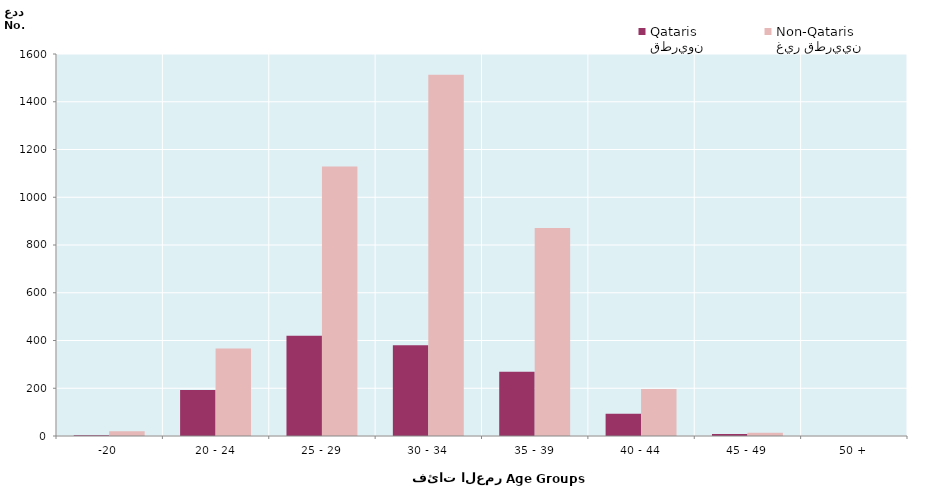
| Category | قطريون
Qataris | غير قطريين
Non-Qataris |
|---|---|---|
| -20 | 3 | 20 |
| 20 - 24 | 193 | 367 |
| 25 - 29 | 420 | 1129 |
| 30 - 34 | 380 | 1513 |
| 35 - 39 | 269 | 871 |
| 40 - 44 | 93 | 197 |
| 45 - 49 | 8 | 14 |
| 50 + | 0 | 0 |